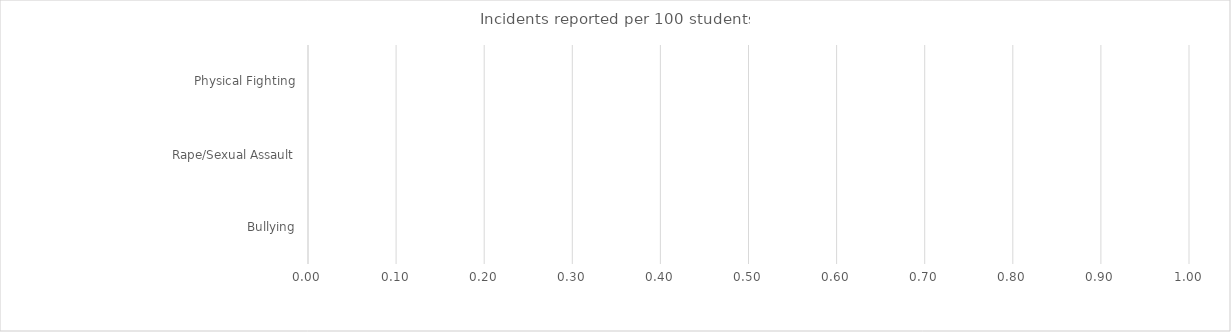
| Category | Benchmark | Entire LEA  | Title IV-A Identified Schools |
|---|---|---|---|
| Physical Fighting | 0 | 0 | 0 |
| Rape/Sexual Assault | 0 | 0 | 0 |
| Bullying | 0 | 0 | 0 |